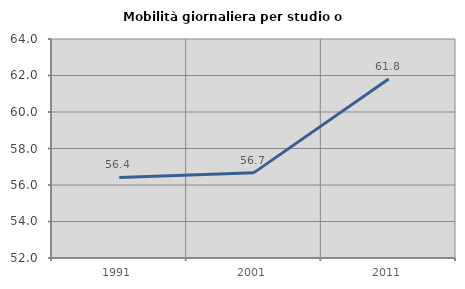
| Category | Mobilità giornaliera per studio o lavoro |
|---|---|
| 1991.0 | 56.415 |
| 2001.0 | 56.678 |
| 2011.0 | 61.806 |